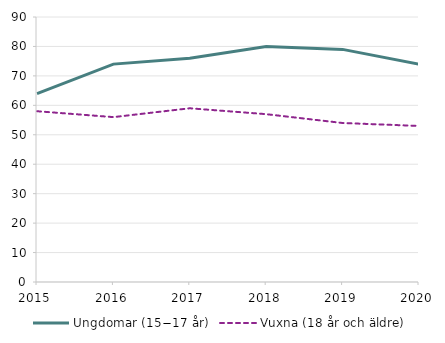
| Category | Ungdomar (15−17 år)  | Vuxna (18 år och äldre)  |
|---|---|---|
| 2015 | 64 | 58 |
| 2016 | 74 | 56 |
| 2017 | 76 | 59 |
| 2018 | 80 | 57 |
| 2019 | 79 | 54 |
| 2020 | 74 | 53 |